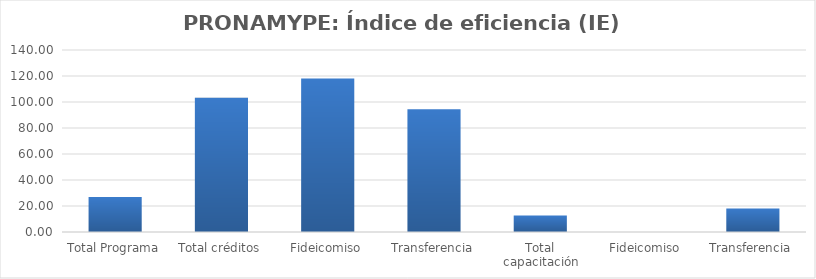
| Category | Índice de eficiencia (IE)  |
|---|---|
| Total Programa | 26.939 |
| Total créditos | 103.203 |
| Fideicomiso | 118.129 |
| Transferencia | 94.436 |
| Total capacitación | 12.712 |
| Fideicomiso | 0 |
| Transferencia | 18.104 |